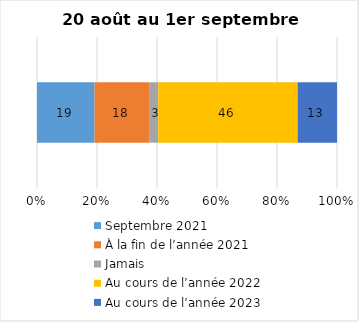
| Category | Septembre 2021 | À la fin de l’année 2021 | Jamais | Au cours de l’année 2022 | Au cours de l’année 2023 |
|---|---|---|---|---|---|
| 0 | 19 | 18 | 3 | 46 | 13 |